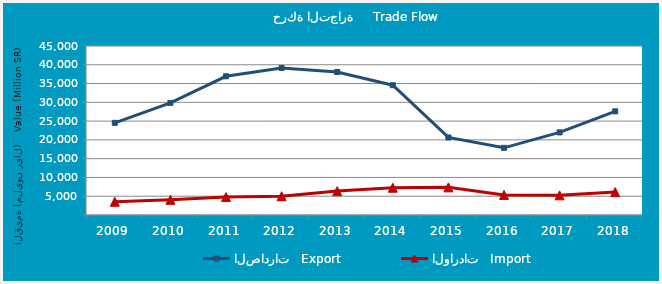
| Category | الصادرات   Export | الواردات   Import |
|---|---|---|
| 2009.0 | 24533983589 | 3529591876 |
| 2010.0 | 29849416932 | 4044019041 |
| 2011.0 | 36934933635 | 4779764239 |
| 2012.0 | 39121340141 | 4996460700 |
| 2013.0 | 38080594574 | 6359872934 |
| 2014.0 | 34558930393 | 7265595645 |
| 2015.0 | 20652294631 | 7359149425 |
| 2016.0 | 17884385105 | 5352565947 |
| 2017.0 | 21993066267 | 5229445824 |
| 2018.0 | 27594919442 | 6098682511 |